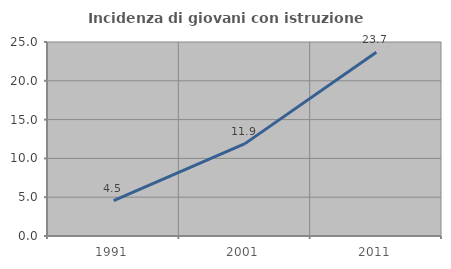
| Category | Incidenza di giovani con istruzione universitaria |
|---|---|
| 1991.0 | 4.545 |
| 2001.0 | 11.905 |
| 2011.0 | 23.684 |